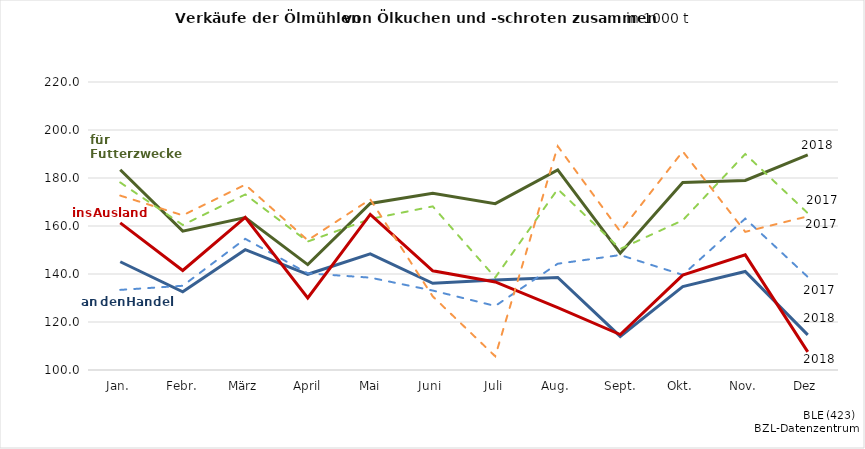
| Category | Series 0 | Series 1 | Series 2 | Series 3 | Series 4 | Series 5 |
|---|---|---|---|---|---|---|
| Jan. | 183.45 | 178.142 | 145.096 | 133.378 | 161.312 | 172.667 |
|  Febr. | 157.861 | 160.421 | 132.569 | 135.096 | 141.477 | 164.449 |
| März | 163.52 | 173.139 | 150.129 | 154.654 | 163.578 | 177.218 |
|  April | 143.921 | 153.526 | 139.88 | 140.276 | 129.994 | 154.058 |
|  Mai | 169.38 | 162.921 | 148.36 | 138.485 | 164.815 | 171.102 |
| Juni | 173.649 | 168.168 | 136.109 | 133.104 | 141.331 | 130.662 |
| Juli | 169.304 | 138.548 | 137.481 | 126.681 | 136.703 | 105.706 |
| Aug. | 183.384 | 175.375 | 138.534 | 144.278 | 126.001 | 193.236 |
|  Sept. | 148.692 | 150.45 | 113.998 | 147.904 | 114.768 | 157.697 |
| Okt. | 178.106 | 162.381 | 134.753 | 139.63 | 139.506 | 191.077 |
| Nov. | 178.991 | 190.002 | 141.045 | 163.075 | 147.968 | 157.571 |
| Dez | 189.644 | 165.355 | 114.654 | 138.78 | 107.552 | 164.027 |